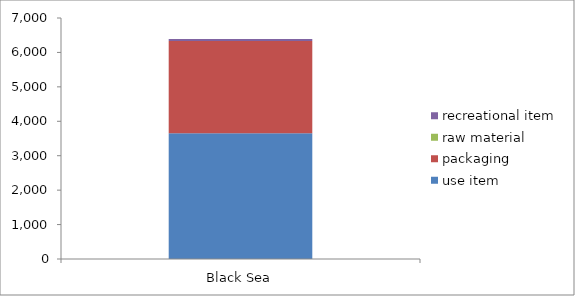
| Category | use item | packaging | raw material | recreational item |
|---|---|---|---|---|
| Black Sea | 3653 | 2676 | 0 | 58 |